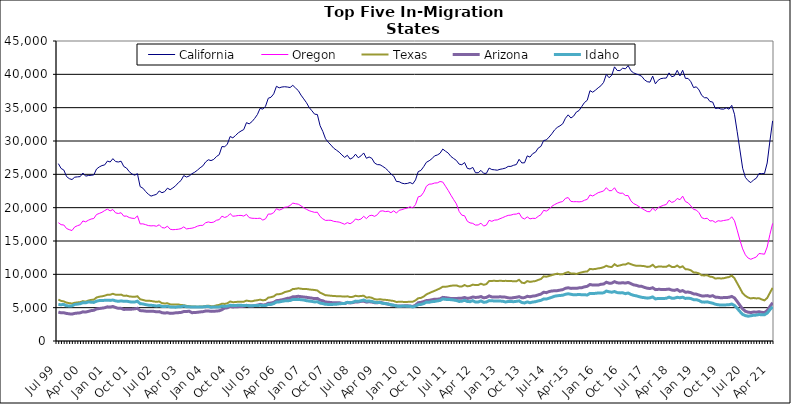
| Category | California | Oregon | Texas | Arizona | Idaho |
|---|---|---|---|---|---|
| Jul 99 | 26605 | 17749 | 6209 | 4339 | 5471 |
| Aug 99 | 25882 | 17447 | 6022 | 4228 | 5444 |
| Sep 99 | 25644 | 17401 | 5941 | 4237 | 5488 |
| Oct 99 | 24669 | 16875 | 5751 | 4134 | 5279 |
| Nov 99 | 24353 | 16701 | 5680 | 4073 | 5260 |
| Dec 99 | 24218 | 16570 | 5619 | 4042 | 5269 |
| Jan 00 | 24574 | 17109 | 5736 | 4142 | 5485 |
| Feb 00 | 24620 | 17295 | 5789 | 4192 | 5530 |
| Mar 00 | 24655 | 17436 | 5826 | 4226 | 5590 |
| Apr 00 | 25195 | 18009 | 5980 | 4375 | 5748 |
| May 00 | 24730 | 17875 | 5897 | 4337 | 5729 |
| Jun 00 | 24825 | 18113 | 6070 | 4444 | 5853 |
| Jul 00 | 24857 | 18294 | 6163 | 4555 | 5824 |
| Aug 00 | 24913 | 18376 | 6199 | 4603 | 5788 |
| Sep 00 | 25792 | 18971 | 6529 | 4804 | 5976 |
| Oct 00 | 26106 | 19135 | 6643 | 4870 | 6058 |
| Nov 00 | 26315 | 19306 | 6705 | 4926 | 6085 |
| Dec 00 | 26415 | 19570 | 6793 | 4991 | 6096 |
| Jan 01 | 26995 | 19781 | 6942 | 5122 | 6119 |
| Feb 01 | 26851 | 19519 | 6948 | 5089 | 6090 |
| Mar 01 | 27352 | 19720 | 7080 | 5180 | 6143 |
| Apr 01 | 26918 | 19221 | 6943 | 5020 | 6020 |
| May 01 | 26848 | 19126 | 6924 | 4899 | 5950 |
| Jun 01 | 26974 | 19241 | 6959 | 4895 | 6019 |
| Jul 01 | 26172 | 18725 | 6778 | 4737 | 5951 |
| Aug 01 | 25943 | 18736 | 6810 | 4757 | 5973 |
| Sep 01 | 25399 | 18514 | 6688 | 4753 | 5895 |
| Oct 01 | 25050 | 18415 | 6650 | 4780 | 5833 |
| Nov 01 | 24873 | 18381 | 6631 | 4826 | 5850 |
| Dec 01 | 25099 | 18765 | 6708 | 4898 | 5969 |
| Jan 02 | 23158 | 17561 | 6261 | 4560 | 5595 |
| Feb 02 | 22926 | 17573 | 6162 | 4531 | 5560 |
| Mar 02 | 22433 | 17452 | 6052 | 4481 | 5458 |
| Apr 02 | 22012 | 17314 | 6046 | 4458 | 5380 |
| May 02 | 21733 | 17267 | 6007 | 4452 | 5358 |
| Jun 02 | 21876 | 17298 | 5933 | 4444 | 5315 |
| Jul 02 | 21997 | 17209 | 5873 | 4383 | 5243 |
| Aug 02 | 22507 | 17436 | 5929 | 4407 | 5315 |
| Sep 02 | 22244 | 17010 | 5672 | 4248 | 5192 |
| Oct 02 | 22406 | 16952 | 5625 | 4191 | 5167 |
| Nov 02 | 22922 | 17223 | 5663 | 4242 | 5221 |
| Dec 02 | 22693 | 16770 | 5499 | 4142 | 5120 |
| Jan 03 | 22964 | 16694 | 5463 | 4166 | 5089 |
| Feb 03 | 23276 | 16727 | 5461 | 4226 | 5077 |
| Mar 03 | 23736 | 16766 | 5486 | 4251 | 5145 |
| Apr 03 | 24079 | 16859 | 5389 | 4289 | 5145 |
| May 03 | 24821 | 17117 | 5378 | 4415 | 5254 |
| Jun 03 | 24592 | 16812 | 5273 | 4426 | 5135 |
| Jul 03 | 24754 | 16875 | 5226 | 4466 | 5124 |
| Aug 03 | 25092 | 16922 | 5181 | 4244 | 5100 |
| Sep 03 | 25316 | 17036 | 5181 | 4279 | 5086 |
| Oct 03 | 25622 | 17228 | 5139 | 4301 | 5110 |
| Nov 03 | 25984 | 17335 | 5175 | 4362 | 5091 |
| Dec 03 | 26269 | 17350 | 5189 | 4396 | 5113 |
| Jan 04 | 26852 | 17734 | 5255 | 4492 | 5152 |
| Feb 04 | 27184 | 17860 | 5301 | 4502 | 5183 |
| Mar 04 | 27062 | 17757 | 5227 | 4443 | 5056 |
| Apr 04 | 27238 | 17840 | 5227 | 4461 | 5104 |
| May 04 | 27671 | 18113 | 5345 | 4493 | 5095 |
| Jun 04 | 27949 | 18201 | 5416 | 4532 | 5103 |
| Jul 04 | 29172 | 18727 | 5597 | 4697 | 5231 |
| Aug 04 | 29122 | 18529 | 5561 | 4945 | 5197 |
| Sep 04 | 29542 | 18678 | 5656 | 4976 | 5237 |
| Oct 04 | 30674 | 19108 | 5922 | 5188 | 5363 |
| Nov 04 | 30472 | 18716 | 5823 | 5106 | 5321 |
| Dec 04 | 30831 | 18755 | 5838 | 5135 | 5312 |
| Jan 05 | 31224 | 18823 | 5906 | 5155 | 5374 |
| Feb 05 | 31495 | 18842 | 5898 | 5168 | 5357 |
| Mar 05 | 31714 | 18738 | 5894 | 5212 | 5313 |
| Apr 05 | 32750 | 18998 | 6060 | 5340 | 5350 |
| May 05 | 32575 | 18504 | 5989 | 5269 | 5276 |
| Jun 05 | 32898 | 18414 | 5954 | 5252 | 5271 |
| Jul 05 | 33384 | 18395 | 6062 | 5322 | 5322 |
| Aug 05 | 33964 | 18381 | 6113 | 5375 | 5316 |
| Sep 05 | 34897 | 18426 | 6206 | 5493 | 5362 |
| Oct 05 | 34780 | 18132 | 6100 | 5408 | 5308 |
| Nov 05 | 35223 | 18332 | 6162 | 5434 | 5314 |
| Dec 05 | 36415 | 19047 | 6508 | 5658 | 5487 |
| Jan 06 | 36567 | 19032 | 6576 | 5688 | 5480 |
| Feb 06 | 37074 | 19257 | 6692 | 5792 | 5616 |
| Mar 06 | 38207 | 19845 | 6993 | 6052 | 5850 |
| Apr 06 | 37976 | 19637 | 7024 | 6101 | 5864 |
| May 06 | 38099 | 19781 | 7114 | 6178 | 5943 |
| Jun 06 | 38141 | 20061 | 7331 | 6276 | 6018 |
| Jul 06 | 38097 | 20111 | 7431 | 6399 | 6046 |
| Aug 06 | 38021 | 20333 | 7542 | 6450 | 6064 |
| Sep 06 | 38349 | 20686 | 7798 | 6627 | 6232 |
| Oct 06 | 37947 | 20591 | 7825 | 6647 | 6216 |
| Nov 06 | 37565 | 20526 | 7907 | 6707 | 6244 |
| Dec 06 | 36884 | 20272 | 7840 | 6648 | 6192 |
| Jan 07 | 36321 | 19984 | 7789 | 6597 | 6151 |
| Feb 07 | 35752 | 19752 | 7799 | 6554 | 6048 |
| Mar 07 | 35025 | 19547 | 7737 | 6487 | 5989 |
| Apr 07 | 34534 | 19412 | 7685 | 6430 | 5937 |
| May 07 | 34022 | 19296 | 7654 | 6353 | 5858 |
| Jun 07 | 33974 | 19318 | 7577 | 6390 | 5886 |
| Jul 07 | 32298 | 18677 | 7250 | 6117 | 5682 |
| Aug 07 | 31436 | 18322 | 7070 | 6034 | 5617 |
| Sep 07 | 30331 | 18087 | 6853 | 5847 | 5500 |
| Oct 07 | 29813 | 18108 | 6839 | 5821 | 5489 |
| Nov 07 | 29384 | 18105 | 6777 | 5769 | 5481 |
| Dec 07 | 28923 | 17949 | 6760 | 5733 | 5499 |
| Jan 08 | 28627 | 17890 | 6721 | 5732 | 5521 |
| Feb 08 | 28328 | 17834 | 6719 | 5749 | 5579 |
| Mar 08 | 27911 | 17680 | 6690 | 5650 | 5614 |
| Apr 08 | 27543 | 17512 | 6656 | 5612 | 5635 |
| May 08 | 27856 | 17754 | 6705 | 5774 | 5798 |
| Jun 08 | 27287 | 17589 | 6593 | 5717 | 5745 |
| Jul 08 | 27495 | 17834 | 6623 | 5761 | 5807 |
| Aug 08 | 28018 | 18309 | 6789 | 5867 | 5982 |
| Sep-08 | 27491 | 18164 | 6708 | 5864 | 5954 |
| Oct 08 | 27771 | 18291 | 6755 | 5942 | 6032 |
| Nov 08 | 28206 | 18706 | 6787 | 5970 | 6150 |
| Dec 08 | 27408 | 18353 | 6505 | 5832 | 5975 |
| Jan 09 | 27601 | 18778 | 6569 | 5890 | 5995 |
| Feb 09 | 27394 | 18863 | 6483 | 5845 | 5936 |
| Mar 09 | 26690 | 18694 | 6273 | 5751 | 5806 |
| Apr 09 | 26461 | 18943 | 6222 | 5735 | 5777 |
| May 09 | 26435 | 19470 | 6272 | 5819 | 5767 |
| Jun 09 | 26187 | 19522 | 6199 | 5700 | 5649 |
| Jul 09 | 25906 | 19408 | 6171 | 5603 | 5617 |
| Aug 09 | 25525 | 19469 | 6128 | 5533 | 5540 |
| Sep 09 | 25050 | 19249 | 6059 | 5405 | 5437 |
| Oct 09 | 24741 | 19529 | 6004 | 5349 | 5369 |
| Nov 09 | 23928 | 19187 | 5854 | 5271 | 5248 |
| Dec 09 | 23899 | 19607 | 5886 | 5261 | 5195 |
| Jan 10 | 23676 | 19703 | 5881 | 5232 | 5234 |
| Feb 10 | 23592 | 19845 | 5850 | 5272 | 5236 |
| Mar 10 | 23634 | 19946 | 5864 | 5278 | 5219 |
| Apr 10 | 23774 | 20134 | 5889 | 5257 | 5201 |
| May 10 | 23567 | 19966 | 5897 | 5172 | 5105 |
| Jun 10 | 24166 | 20464 | 6087 | 5356 | 5237 |
| Jul 10 | 25410 | 21627 | 6417 | 5742 | 5452 |
| Aug 10 | 25586 | 21744 | 6465 | 5797 | 5491 |
| Sep 10 | 26150 | 22314 | 6667 | 5907 | 5609 |
| Oct 10 | 26807 | 23219 | 6986 | 6070 | 5831 |
| Nov 10 | 27033 | 23520 | 7179 | 6100 | 5810 |
| Dec 10 | 27332 | 23551 | 7361 | 6182 | 5898 |
| Jan 11 | 27769 | 23697 | 7525 | 6276 | 5938 |
| Feb 11 | 27898 | 23718 | 7708 | 6267 | 6016 |
| Mar 11 | 28155 | 23921 | 7890 | 6330 | 6081 |
| Apr 11 | 28790 | 23847 | 8146 | 6544 | 6305 |
| May 11 | 28471 | 23215 | 8131 | 6502 | 6248 |
| Jun 11 | 28191 | 22580 | 8199 | 6445 | 6217 |
| Jul 11 | 27678 | 21867 | 8291 | 6368 | 6202 |
| Aug 11 | 27372 | 21203 | 8321 | 6356 | 6146 |
| Sep 11 | 27082 | 20570 | 8341 | 6387 | 6075 |
| Oct 11 | 26528 | 19442 | 8191 | 6402 | 5932 |
| Nov 11 | 26440 | 18872 | 8176 | 6426 | 5968 |
| Dec 11 | 26770 | 18784 | 8401 | 6533 | 6106 |
| Jan 12 | 25901 | 17963 | 8202 | 6390 | 5933 |
| Feb 12 | 25796 | 17718 | 8266 | 6456 | 5900 |
| Mar 12 | 26042 | 17647 | 8456 | 6600 | 6054 |
| Apr 12 | 25239 | 17386 | 8388 | 6534 | 5838 |
| May 12 | 25238 | 17407 | 8401 | 6558 | 5854 |
| Jun 12 | 25593 | 17673 | 8594 | 6669 | 6009 |
| Jul 12 | 25155 | 17237 | 8432 | 6474 | 5817 |
| Aug 12 | 25146 | 17391 | 8536 | 6539 | 5842 |
| Sep 12 | 25942 | 18102 | 8989 | 6759 | 6061 |
| Oct 12 | 25718 | 17953 | 9012 | 6618 | 6027 |
| Nov 12 | 25677 | 18134 | 9032 | 6611 | 6009 |
| Dec 12 | 25619 | 18166 | 8981 | 6601 | 5999 |
| Jan 13 | 25757 | 18344 | 9051 | 6627 | 5989 |
| Feb-13 | 25830 | 18512 | 9001 | 6606 | 5968 |
| Mar-13 | 25940 | 18689 | 9021 | 6577 | 5853 |
| Apr 13 | 26187 | 18844 | 9013 | 6478 | 5925 |
| May 13 | 26192 | 18884 | 9003 | 6431 | 5924 |
| Jun-13 | 26362 | 19013 | 8948 | 6508 | 5896 |
| Jul 13 | 26467 | 19037 | 8958 | 6559 | 5948 |
| Aug 13 | 27253 | 19198 | 9174 | 6655 | 6020 |
| Sep 13 | 26711 | 18501 | 8747 | 6489 | 5775 |
| Oct 13 | 26733 | 18301 | 8681 | 6511 | 5711 |
| Nov 13 | 27767 | 18620 | 8989 | 6709 | 5860 |
| Dec 13 | 27583 | 18320 | 8863 | 6637 | 5740 |
| Jan 14 | 28107 | 18409 | 8939 | 6735 | 5843 |
| Feb-14 | 28313 | 18383 | 8989 | 6779 | 5893 |
| Mar 14 | 28934 | 18696 | 9160 | 6918 | 6015 |
| Apr 14 | 29192 | 18946 | 9291 | 7036 | 6099 |
| May 14 | 30069 | 19603 | 9701 | 7314 | 6304 |
| Jun 14 | 30163 | 19487 | 9641 | 7252 | 6293 |
| Jul-14 | 30587 | 19754 | 9752 | 7415 | 6427 |
| Aug-14 | 31074 | 20201 | 9882 | 7499 | 6557 |
| Sep 14 | 31656 | 20459 | 9997 | 7536 | 6719 |
| Oct 14 | 32037 | 20663 | 10109 | 7555 | 6786 |
| Nov 14 | 32278 | 20825 | 9992 | 7628 | 6831 |
| Dec 14 | 32578 | 20918 | 10006 | 7705 | 6860 |
| Jan 15 | 33414 | 21396 | 10213 | 7906 | 7000 |
| Feb 15 | 33922 | 21518 | 10337 | 7982 | 7083 |
| Mar 15 | 33447 | 20942 | 10122 | 7891 | 7006 |
| Apr-15 | 33731 | 20893 | 10138 | 7906 | 6931 |
| May 15 | 34343 | 20902 | 10053 | 7895 | 6952 |
| Jun-15 | 34572 | 20870 | 10192 | 7973 | 6966 |
| Jul 15 | 35185 | 20916 | 10303 | 8000 | 6949 |
| Aug 15 | 35780 | 21115 | 10399 | 8126 | 6938 |
| Sep 15 | 36109 | 21246 | 10428 | 8207 | 6896 |
| Oct 15 | 37555 | 21908 | 10813 | 8477 | 7140 |
| Nov 15 | 37319 | 21750 | 10763 | 8390 | 7112 |
| Dec 15 | 37624 | 21990 | 10807 | 8395 | 7149 |
| Jan 16 | 37978 | 22248 | 10892 | 8388 | 7201 |
| Feb 16 | 38285 | 22369 | 10951 | 8508 | 7192 |
| Mar 16 | 38792 | 22506 | 11075 | 8547 | 7226 |
| Apr 16 | 39994 | 22999 | 11286 | 8815 | 7487 |
| May 16 | 39488 | 22548 | 11132 | 8673 | 7382 |
| Jun 16 | 39864 | 22556 | 11100 | 8682 | 7315 |
| Jul 16 | 41123 | 22989 | 11516 | 8903 | 7420 |
| Aug 16 | 40573 | 22333 | 11251 | 8731 | 7261 |
| Sep 16 | 40560 | 22162 | 11340 | 8692 | 7216 |
| Oct 16 | 40923 | 22172 | 11456 | 8742 | 7233 |
| Nov 16 | 40817 | 21818 | 11459 | 8685 | 7101 |
| Dec 16 | 41311 | 21815 | 11681 | 8783 | 7203 |
| Jan 17 | 40543 | 21029 | 11524 | 8609 | 6982 |
| Feb 17 | 40218 | 20613 | 11385 | 8416 | 6852 |
| Mar 17 | 40052 | 20425 | 11276 | 8354 | 6775 |
| Apr 17 | 39913 | 20147 | 11297 | 8218 | 6653 |
| May 17 | 39695 | 19910 | 11265 | 8196 | 6552 |
| Jun 17 | 39177 | 19650 | 11225 | 8034 | 6500 |
| Jul 17 | 38901 | 19419 | 11115 | 7923 | 6429 |
| Aug 17 | 38827 | 19389 | 11168 | 7867 | 6479 |
| Sep 17 | 39736 | 19936 | 11426 | 7991 | 6609 |
| Oct 17 | 38576 | 19547 | 11041 | 7708 | 6315 |
| Nov 17 | 39108 | 20013 | 11158 | 7746 | 6381 |
| Dec 17 | 39359 | 20202 | 11185 | 7743 | 6366 |
| Jan 18 | 39420 | 20362 | 11118 | 7736 | 6380 |
| Feb 18 | 39440 | 20476 | 11128 | 7741 | 6407 |
| Mar 18 | 40218 | 21106 | 11362 | 7789 | 6578 |
| Apr 18 | 39637 | 20788 | 11111 | 7642 | 6423 |
| May 18 | 39777 | 20933 | 11097 | 7591 | 6430 |
| Jun 18 | 40602 | 21381 | 11317 | 7721 | 6554 |
| Jul 18 | 39767 | 21189 | 11038 | 7445 | 6489 |
| Aug 18 | 40608 | 21729 | 11200 | 7560 | 6569 |
| Sep 18 | 39395 | 20916 | 10772 | 7318 | 6383 |
| Oct 18 | 39383 | 20724 | 10740 | 7344 | 6429 |
| Nov 18 | 38891 | 20265 | 10605 | 7255 | 6365 |
| Dec 18 | 38013 | 19741 | 10292 | 7069 | 6205 |
| Jan 19 | 38130 | 19643 | 10261 | 7032 | 6203 |
| Feb 19 | 37658 | 19237 | 10132 | 6892 | 6073 |
| Mar 19 | 36831 | 18492 | 9848 | 6766 | 5863 |
| Apr 19 | 36492 | 18349 | 9839 | 6763 | 5827 |
| May 19 | 36481 | 18407 | 9867 | 6809 | 5873 |
| Jun 19 | 35925 | 17998 | 9661 | 6698 | 5761 |
| Jul 19 | 35843 | 18049 | 9598 | 6800 | 5673 |
| Aug 19 | 34870 | 17785 | 9361 | 6577 | 5512 |
| Sep 19 | 34945 | 18038 | 9428 | 6547 | 5437 |
| Oct 19 | 34802 | 17977 | 9385 | 6483 | 5390 |
| Nov 19 | 34775 | 18072 | 9403 | 6511 | 5401 |
| Dec 19 | 34976 | 18140 | 9518 | 6521 | 5419 |
| Jan 20 | 34774 | 18209 | 9594 | 6561 | 5434 |
| Feb 20 | 35352 | 18632 | 9804 | 6682 | 5543 |
| Mar 20 | 34013 | 18041 | 9411 | 6464 | 5330 |
| Apr 20 | 31385 | 16629 | 8666 | 5922 | 4906 |
| May 20 | 28657 | 15123 | 7927 | 5355 | 4419 |
| Jun 20 | 25915 | 13817 | 7164 | 4815 | 3992 |
| Jul 20 | 24545 | 12926 | 6776 | 4457 | 3810 |
| Aug 20 | 24048 | 12443 | 6521 | 4326 | 3720 |
| Sep 20 | 23756 | 12258 | 6386 | 4266 | 3784 |
| Oct 20 | 24166 | 12429 | 6452 | 4347 | 3861 |
| Nov 20 | 24404 | 12597 | 6386 | 4324 | 3883 |
| Dec 20 | 25120 | 13122 | 6420 | 4394 | 3974 |
| Jan 21 | 25111 | 13080 | 6236 | 4304 | 3924 |
| Feb 21 | 25114 | 13015 | 6094 | 4260 | 3930 |
| Mar 21 | 26701 | 14096 | 6455 | 4567 | 4185 |
| Apr 21 | 29998 | 15978 | 7222 | 5164 | 4697 |
| May 21 | 33020 | 17641 | 7969 | 5748 | 5148 |